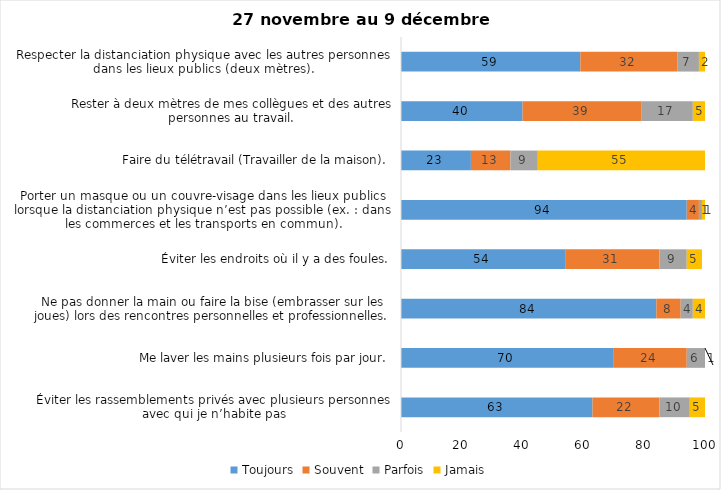
| Category | Toujours | Souvent | Parfois | Jamais |
|---|---|---|---|---|
| Éviter les rassemblements privés avec plusieurs personnes avec qui je n’habite pas | 63 | 22 | 10 | 5 |
| Me laver les mains plusieurs fois par jour. | 70 | 24 | 6 | 1 |
| Ne pas donner la main ou faire la bise (embrasser sur les joues) lors des rencontres personnelles et professionnelles. | 84 | 8 | 4 | 4 |
| Éviter les endroits où il y a des foules. | 54 | 31 | 9 | 5 |
| Porter un masque ou un couvre-visage dans les lieux publics lorsque la distanciation physique n’est pas possible (ex. : dans les commerces et les transports en commun). | 94 | 4 | 1 | 1 |
| Faire du télétravail (Travailler de la maison). | 23 | 13 | 9 | 55 |
| Rester à deux mètres de mes collègues et des autres personnes au travail. | 40 | 39 | 17 | 5 |
| Respecter la distanciation physique avec les autres personnes dans les lieux publics (deux mètres). | 59 | 32 | 7 | 2 |